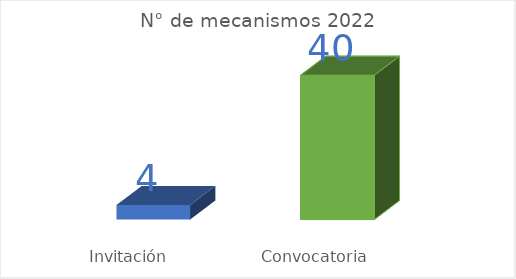
| Category | Series 0 |
|---|---|
| Invitación  | 4 |
| Convocatoria  | 40 |